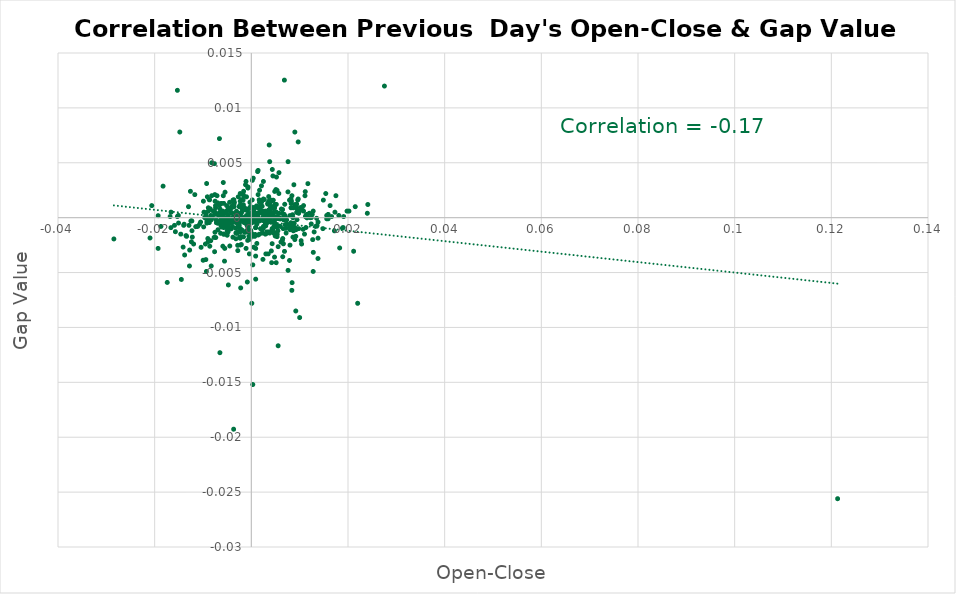
| Category | Series 0 |
|---|---|
| 0.00495000000000001 | -0.001 |
| 0.006469999999999976 | 0.001 |
| 0.0007399999999999629 | 0 |
| -0.0021799999999998487 | 0 |
| -0.005789999999999962 | 0 |
| 0.0011399999999999189 | -0.001 |
| -0.006360000000000143 | -0.001 |
| 0.005319999999999991 | 0 |
| 0.005269999999999886 | -0.001 |
| -4.999999999988347e-05 | 0.001 |
| 0.006209999999999827 | 0.001 |
| -0.012280000000000069 | -0.001 |
| -0.00723000000000007 | 0 |
| 0.0033999999999998476 | 0.001 |
| 0.011379999999999946 | 0 |
| 0.004929999999999879 | -0.001 |
| -0.005859999999999976 | 0 |
| 0.0014400000000001079 | 0 |
| 0.0040800000000000836 | 0 |
| -0.004890000000000061 | 0.001 |
| -0.009909999999999863 | 0.002 |
| 0.012419999999999876 | 0 |
| -0.0046999999999999265 | -0.001 |
| -0.006139999999999812 | -0.001 |
| 0.00270999999999999 | 0 |
| 4.0000000000040004e-05 | 0 |
| -0.005409999999999915 | 0 |
| 0.006639999999999979 | -0.002 |
| 0.006750000000000034 | 0 |
| 0.006129999999999969 | -0.002 |
| 0.008960000000000079 | 0.001 |
| -0.0035999999999998256 | 0.001 |
| -0.0042400000000000215 | 0 |
| -0.007359999999999811 | -0.002 |
| 0.0022400000000000198 | 0.001 |
| 0.005009999999999959 | 0 |
| 0.010199999999999987 | 0.001 |
| 0.00046999999999997044 | 0.001 |
| -0.004170000000000007 | -0.001 |
| -0.005929999999999991 | 0 |
| 0.005549999999999944 | -0.012 |
| 0.006839999999999957 | 0.013 |
| 0.0011399999999999189 | -0.002 |
| 0.005090000000000039 | 0.003 |
| -0.002529999999999921 | 0 |
| -0.008920000000000039 | -0.002 |
| -0.00017000000000000348 | 0.001 |
| -0.0022400000000000198 | -0.002 |
| 0.0034199999999999786 | 0 |
| -0.0001100000000000545 | -0.001 |
| -0.012210000000000054 | -0.002 |
| -0.0046399999999999775 | 0 |
| 0.000180000000000069 | 0.002 |
| 0.005169999999999897 | 0.001 |
| 9.000000000014552e-05 | -0.001 |
| -0.0007599999999998719 | -0.002 |
| -0.015060000000000073 | 0 |
| 0.012400000000000189 | -0.001 |
| -0.0021700000000000053 | 0 |
| 0.00934999999999997 | 0.001 |
| 0.0008900000000000574 | -0.001 |
| -0.006119999999999903 | 0 |
| -0.0013900000000000023 | -0.001 |
| -0.0016399999999998638 | 0.001 |
| -0.0018499999999999073 | -0.001 |
| 0.008529999999999927 | 0 |
| 0.006960000000000077 | 0 |
| 0.005549999999999944 | -0.003 |
| -0.006909999999999972 | 0.001 |
| -0.0028199999999998226 | -0.003 |
| 0.005109999999999948 | 0.001 |
| 0.012190000000000145 | 0 |
| -0.0049000000000001265 | 0 |
| 0.009379999999999944 | -0.001 |
| -0.0015499999999999403 | 0 |
| -0.004110000000000058 | 0 |
| 0.0016199999999999548 | 0.002 |
| 0.013789999999999969 | -0.004 |
| -0.02844000000000002 | -0.002 |
| -0.018260000000000165 | 0.003 |
| 0.02754000000000012 | 0.012 |
| -0.00924999999999998 | 0.003 |
| 0.007009999999999961 | -0.001 |
| -0.007520000000000193 | -0.001 |
| -0.0009400000000001629 | -0.001 |
| 0.00399000000000016 | 0 |
| -0.01193999999999984 | -0.002 |
| 0.00391000000000008 | 0 |
| 0.007160000000000055 | -0.001 |
| 0.0005100000000000104 | -0.003 |
| 0.005349999999999966 | 0 |
| -0.008829999999999893 | 0.001 |
| 0.0005599999999998939 | 0 |
| 0.010599999999999943 | 0.001 |
| 0.0025199999999998557 | 0 |
| -0.0020999999999999908 | -0.002 |
| 0.00757999999999992 | 0.002 |
| -0.0020699999999997942 | 0.002 |
| 0.0042400000000000215 | 0.002 |
| -0.0005900000000000905 | -0.001 |
| 0.002909999999999968 | -0.001 |
| -0.009409999999999918 | -0.004 |
| -0.02096000000000009 | -0.002 |
| -0.000320000000000098 | -0.002 |
| 0.0034799999999999276 | 0 |
| 0.005610000000000115 | -0.001 |
| -0.015710000000000113 | -0.001 |
| 0.0049399999999999444 | -0.002 |
| 0.0014099999999999113 | -0.002 |
| -0.003810000000000091 | -0.002 |
| -0.006569999999999965 | 0.001 |
| 0.011160000000000059 | 0.002 |
| -0.0024199999999998667 | -0.002 |
| 0.007400000000000073 | -0.001 |
| 0.004850000000000021 | -0.001 |
| -0.004730000000000123 | 0 |
| 0.005220000000000002 | 0 |
| -0.002689999999999859 | 0 |
| -0.00478999999999985 | -0.001 |
| 0.008180000000000076 | 0 |
| -0.004850000000000021 | 0 |
| -0.00254999999999983 | 0 |
| -0.005710000000000104 | 0.001 |
| 0.008240000000000025 | 0.001 |
| 0.00032999999999994145 | 0 |
| -0.014109999999999845 | -0.003 |
| -0.0014800000000001479 | 0 |
| 0.00048000000000003595 | 0.001 |
| -0.0015600000000000058 | 0 |
| 0.003940000000000055 | 0 |
| 0.0015600000000000058 | 0.001 |
| -0.009299999999999864 | 0 |
| -0.003069999999999906 | 0.001 |
| 0.006860000000000088 | -0.003 |
| 0.005719999999999947 | 0.004 |
| -0.0015399999999998748 | 0.002 |
| -0.008720000000000061 | 0.002 |
| 0.0012199999999999989 | 0 |
| 0.0029799999999999827 | -0.001 |
| -0.013510000000000133 | -0.002 |
| 0.01150999999999991 | 0 |
| -0.008650000000000047 | 0.002 |
| -0.009649999999999936 | 0 |
| -0.005420000000000202 | 0 |
| 0.0026800000000000157 | 0.002 |
| 0.0045399999999999885 | 0.002 |
| 0.0041400000000000325 | -0.003 |
| 0.003589999999999982 | 0.002 |
| 0.006909999999999972 | 0.001 |
| -0.005440000000000111 | 0.002 |
| 0.008429999999999938 | -0.006 |
| 0.0037000000000000366 | 0.007 |
| -0.0007699999999999374 | 0 |
| -0.0048200000000000465 | 0 |
| 0.008379999999999832 | -0.007 |
| -0.00939000000000001 | 0 |
| 0.0046800000000000175 | 0.001 |
| 0.018850000000000033 | -0.001 |
| 0.003530000000000033 | 0 |
| 0.0010700000000001264 | 0 |
| 0.005139999999999922 | -0.004 |
| -0.003190000000000026 | 0 |
| -0.0036399999999998656 | 0 |
| 0.005330000000000057 | -0.002 |
| 0.0011300000000000754 | 0 |
| 0.0010900000000000354 | 0.001 |
| -0.011499999999999844 | -0.001 |
| -0.003249999999999975 | -0.001 |
| -0.007540000000000102 | 0.002 |
| -0.012759999999999883 | -0.003 |
| -0.0019899999999999363 | -0.001 |
| -0.0016200000000001769 | -0.002 |
| 0.0015400000000000968 | 0 |
| -0.005250000000000199 | -0.001 |
| 0.008399999999999963 | 0.002 |
| 0.004690000000000083 | -0.001 |
| -0.0021799999999998487 | 0 |
| 0.004809999999999981 | 0.001 |
| 0.013600000000000056 | -0.001 |
| 0.007919999999999927 | -0.001 |
| -0.0010300000000000864 | 0 |
| -0.008690000000000087 | 0 |
| 3.0000000000196536e-05 | 0 |
| -0.0029999999999998916 | 0 |
| -0.0005300000000001415 | 0 |
| -0.004029999999999978 | 0 |
| -0.0026600000000001067 | -0.001 |
| -0.0017100000000001003 | 0.002 |
| 0.006429999999999936 | -0.002 |
| 0.008610000000000007 | -0.002 |
| 0.013800000000000034 | -0.002 |
| -0.0023200000000000998 | -0.002 |
| 0.0043400000000000105 | 0.004 |
| -0.019279999999999964 | 0 |
| -0.0014399999999998858 | 0 |
| 0.010709999999999997 | -0.001 |
| 0.009449999999999958 | 0 |
| 0.0047999999999999154 | -0.004 |
| -0.003190000000000026 | -0.002 |
| -0.0022800000000000598 | 0 |
| -0.0044600000000001305 | -0.003 |
| -0.0016800000000001258 | 0 |
| 0.003940000000000055 | 0.001 |
| -0.0029200000000000337 | 0 |
| -0.0023400000000000087 | 0.001 |
| 0.005319999999999991 | 0.002 |
| 0.004310000000000036 | -0.002 |
| 0.008190000000000142 | -0.001 |
| -0.01929000000000003 | -0.003 |
| -0.009190000000000031 | 0 |
| -0.0022800000000000598 | 0.001 |
| -0.007640000000000091 | 0.005 |
| -0.0006999999999999229 | -0.001 |
| -0.0031999999999998696 | 0 |
| 0.01028999999999991 | 0.001 |
| -0.006680000000000019 | 0 |
| -0.0025100000000000122 | -0.001 |
| -0.016639999999999988 | -0.001 |
| 0.008879999999999999 | -0.001 |
| -0.0020599999999999508 | -0.002 |
| -0.003610000000000113 | 0.002 |
| -0.0022500000000000853 | -0.001 |
| 0.021160000000000068 | -0.003 |
| -0.0010900000000000354 | -0.003 |
| 0.013509999999999911 | 0 |
| -0.009970000000000034 | -0.004 |
| -0.0004799999999998139 | 0 |
| -0.006139999999999812 | 0 |
| -0.0041400000000000325 | -0.001 |
| 0.00021000000000004349 | 0.003 |
| -0.0022900000000001253 | 0.001 |
| 0.009460000000000024 | 0 |
| -0.008110000000000062 | 0 |
| 0.0048400000000001775 | 0.002 |
| -0.0033400000000001207 | 0 |
| 0.00010000000000021103 | 0 |
| -0.0026600000000001067 | -0.001 |
| 0.009380000000000166 | 0.001 |
| 0.007980000000000098 | 0 |
| 0.0007999999999999119 | -0.002 |
| 0.00399000000000016 | 0 |
| 0.004469999999999974 | 0.004 |
| -0.0037199999999999456 | 0 |
| -0.0036599999999999966 | -0.019 |
| 0.012820000000000054 | -0.003 |
| -0.00985999999999998 | -0.001 |
| -0.0008300000000001084 | -0.006 |
| -0.006909999999999972 | -0.001 |
| 0.0006299999999999084 | 0 |
| -0.014480000000000048 | -0.006 |
| -0.0030200000000000227 | -0.001 |
| 0.005360000000000031 | -0.002 |
| -0.005549999999999944 | -0.004 |
| -0.004750000000000032 | -0.006 |
| -0.00279000000000007 | 0 |
| 0.0024800000000000377 | -0.001 |
| 0.00649999999999995 | -0.004 |
| 0.018280000000000074 | -0.003 |
| -0.001000000000000112 | 0 |
| 0.011500000000000066 | 0 |
| 0.02400000000000002 | 0 |
| 0.0025999999999999357 | 0 |
| -0.0020000000000000018 | 0 |
| 0.006000000000000005 | 0 |
| 0.009199999999999875 | -0.002 |
| 0.0037000000000000366 | 0.001 |
| 0.0038000000000000256 | 0.001 |
| -0.006199999999999983 | 0.001 |
| 0.011700000000000044 | 0.003 |
| 0.01629999999999998 | 0.001 |
| -0.0049000000000001265 | -0.001 |
| 0.0032999999999998586 | -0.001 |
| 0.12129999999999996 | -0.026 |
| -0.015300000000000091 | 0.012 |
| 0.01980000000000004 | 0.001 |
| -0.009300000000000086 | -0.005 |
| 0.0052000000000000934 | -0.001 |
| 0.010800000000000143 | 0.001 |
| 0.009000000000000119 | -0.001 |
| 0.005499999999999838 | -0.001 |
| -0.001000000000000112 | -0.001 |
| -0.008199999999999985 | 0.005 |
| -0.0047999999999999154 | -0.001 |
| -0.006900000000000128 | -0.001 |
| 0.013299999999999867 | -0.001 |
| 0.0019000000000000128 | -0.001 |
| 0.00019999999999997797 | -0.002 |
| -0.010699999999999932 | -0.001 |
| -0.005700000000000038 | -0.002 |
| 0.009200000000000097 | -0.001 |
| -0.00649999999999995 | -0.012 |
| -0.0027999999999999137 | -0.001 |
| 0.008700000000000152 | 0 |
| 0.011399999999999855 | 0 |
| -0.0048000000000001375 | 0 |
| 0.015600000000000058 | 0 |
| 0.009400000000000075 | 0 |
| 9.999999999998899e-05 | -0.008 |
| -0.007600000000000051 | -0.003 |
| 0.0004999999999999449 | 0 |
| -0.006699999999999928 | 0 |
| 0.0037000000000000366 | 0 |
| 0.006799999999999917 | 0 |
| 0.009799999999999809 | -0.001 |
| 0.00010000000000021103 | 0 |
| 0.015900000000000025 | 0 |
| -0.011700000000000044 | 0.002 |
| 0.008099999999999996 | -0.001 |
| 0.0022999999999999687 | 0.001 |
| 0.0028999999999999027 | 0 |
| -0.0051000000000001044 | 0.001 |
| 0.004899999999999904 | 0.001 |
| 0.006000000000000005 | -0.001 |
| 0.0013000000000000789 | 0 |
| 0.008700000000000152 | 0.001 |
| 0.0014000000000000679 | 0.002 |
| -0.00019999999999997797 | -0.001 |
| -0.0036000000000000476 | 0.001 |
| 0.0017000000000000348 | 0 |
| -0.0017000000000000348 | 0.002 |
| 0.00019999999999997797 | 0 |
| 0.00029999999999996696 | 0.001 |
| -0.013399999999999856 | -0.002 |
| 0.0034999999999998366 | -0.003 |
| 0.00029999999999996696 | -0.004 |
| 9.999999999998899e-05 | 0 |
| -0.0044999999999999485 | -0.001 |
| 0.009700000000000042 | 0.001 |
| 0.0026000000000001577 | 0 |
| 0.017200000000000104 | -0.001 |
| 0.004899999999999904 | 0.001 |
| -0.0040999999999999925 | 0.001 |
| 0.021499999999999853 | 0.001 |
| -0.012899999999999912 | -0.001 |
| -0.0030999999999998806 | 0 |
| 0.008000000000000007 | -0.001 |
| -0.009200000000000097 | 0 |
| -0.0022999999999999687 | 0.002 |
| -0.02059999999999995 | 0.001 |
| 0.013800000000000034 | 0 |
| 0.020199999999999996 | 0.001 |
| -0.0030000000000001137 | -0.001 |
| 0.0010999999999998789 | -0.001 |
| -0.0012000000000000899 | 0.003 |
| 0.008000000000000007 | -0.002 |
| 0.0012999999999998568 | 0.004 |
| 0.0016999999999998128 | 0.001 |
| 0.0032000000000000917 | -0.001 |
| -0.007100000000000106 | 0.002 |
| 0.02200000000000002 | -0.008 |
| -0.000700000000000145 | 0.001 |
| 0.0044999999999999485 | 0 |
| 0.0009999999999998899 | 0 |
| 0.00869999999999993 | -0.001 |
| 0.008200000000000207 | -0.001 |
| 0.0038000000000000256 | -0.001 |
| 0.0040999999999999925 | 0.002 |
| -0.0044999999999999485 | 0.001 |
| 0.0009000000000001229 | -0.003 |
| -0.005900000000000016 | 0 |
| -0.00029999999999996696 | 0.001 |
| 0.0045000000000001705 | 0 |
| 0.018100000000000005 | 0 |
| 0.007199999999999873 | -0.001 |
| 0.011099999999999888 | 0.002 |
| -0.0014000000000000679 | 0.001 |
| 0.00029999999999996696 | -0.015 |
| -0.0009999999999998899 | 0 |
| 0.0006999999999999229 | -0.002 |
| -0.0006999999999999229 | 0.003 |
| 0.005700000000000038 | 0 |
| 0.005799999999999805 | 0 |
| 0.0009999999999998899 | 0 |
| 0.0016000000000000458 | 0 |
| 0.001100000000000101 | 0 |
| -0.0005999999999999339 | 0 |
| -0.001100000000000101 | 0 |
| 0.0025999999999999357 | 0 |
| -0.0035999999999998256 | 0.001 |
| 0.0018000000000000238 | 0.001 |
| -0.0039000000000000146 | 0.001 |
| 0.0036000000000000476 | 0 |
| -0.0027999999999999137 | 0 |
| 0.008199999999999985 | 0 |
| 0.0019000000000000128 | 0.001 |
| -0.00019999999999997797 | 0 |
| 0.00029999999999996696 | 0 |
| 0.0047999999999999154 | 0 |
| 0.0020999999999999908 | 0 |
| -0.0034999999999998366 | 0.001 |
| 0.0021999999999999797 | -0.001 |
| -0.0026000000000001577 | -0.001 |
| 0.0021999999999999797 | 0 |
| -0.005499999999999838 | -0.003 |
| 0.0034000000000000696 | 0.001 |
| -0.009100000000000108 | 0.002 |
| -0.008299999999999974 | 0 |
| 0.0050000000000001155 | -0.001 |
| 0.015399999999999858 | 0.002 |
| -0.007000000000000117 | 0 |
| -0.00020000000000020002 | 0 |
| 0.0029000000000001247 | -0.002 |
| -0.006799999999999917 | 0 |
| 0.0036000000000000476 | 0.001 |
| 0.0049000000000001265 | 0 |
| -0.0014000000000000679 | 0 |
| -0.0025999999999999357 | 0 |
| -0.0025000000000001688 | 0 |
| -0.005099999999999882 | 0.001 |
| 0.00869999999999993 | -0.001 |
| 0.01200000000000001 | 0 |
| 0.0040000000000000036 | 0.001 |
| -0.00039999999999995595 | 0 |
| 0.0020999999999999908 | 0.003 |
| 0.014899999999999913 | 0.002 |
| -0.009799999999999809 | 0 |
| 0.0027999999999999137 | 0 |
| -0.006599999999999939 | 0.007 |
| -0.0039000000000000146 | -0.001 |
| 0.0014000000000000679 | 0.004 |
| 0.0020000000000000018 | 0 |
| 0.0009000000000001229 | -0.001 |
| 0.0039000000000000146 | 0 |
| -0.016599999999999948 | 0 |
| 0.0011999999999998678 | 0 |
| -0.0026999999999999247 | 0.002 |
| 0.008199999999999985 | 0.002 |
| 0.019000000000000128 | -0.001 |
| 0.0043000000000001926 | -0.001 |
| 0.010399999999999965 | -0.002 |
| 0.0024999999999999467 | 0.002 |
| 0.004200000000000204 | -0.004 |
| 0.0035999999999998256 | 0.002 |
| -0.001000000000000112 | 0.002 |
| 0.009700000000000042 | 0.002 |
| 0.01079999999999992 | 0.001 |
| -0.0040000000000000036 | 0 |
| -0.0038000000000000256 | 0.002 |
| 0.0047000000000001485 | 0 |
| 0.0040000000000000036 | 0 |
| -0.010400000000000187 | -0.003 |
| 0.00039999999999995595 | 0 |
| -0.005800000000000027 | 0 |
| -0.0024999999999999467 | 0.001 |
| 0.009800000000000031 | 0 |
| 0.012799999999999923 | 0.001 |
| 0.009200000000000097 | -0.008 |
| -0.0023000000000001908 | -0.001 |
| -0.007600000000000051 | 0 |
| 0.016599999999999948 | 0 |
| -0.00039999999999995595 | -0.003 |
| 0.0129999999999999 | -0.001 |
| 0.0038000000000000256 | 0 |
| 0.0039000000000000146 | 0.001 |
| -0.005800000000000027 | 0.002 |
| 0.010999999999999899 | -0.002 |
| -0.006099999999999994 | 0 |
| 0.001000000000000112 | 0 |
| 0.0029000000000001247 | 0.001 |
| -0.00890000000000013 | 0.001 |
| -0.0012000000000000899 | 0.001 |
| 0.008199999999999985 | 0.001 |
| 0.011299999999999866 | -0.001 |
| 0.0012999999999998568 | 0 |
| 0.005499999999999838 | 0 |
| -0.0019000000000000128 | 0.001 |
| 0.0050000000000001155 | 0 |
| 0.00649999999999995 | -0.002 |
| -0.0007999999999999119 | 0.001 |
| -0.006399999999999961 | 0 |
| -0.007900000000000018 | 0.001 |
| -0.007500000000000062 | 0.001 |
| 0.0047999999999999154 | 0.001 |
| 0.0040000000000000036 | 0.001 |
| -0.005700000000000038 | -0.002 |
| -0.012400000000000189 | -0.002 |
| -0.006000000000000005 | -0.001 |
| 0.00969999999999982 | 0.001 |
| -0.015099999999999891 | 0 |
| 0.0042999999999999705 | -0.001 |
| -0.01869999999999994 | -0.001 |
| 0.0017000000000000348 | -0.002 |
| -0.015900000000000025 | -0.001 |
| 0.0052000000000000934 | 0.004 |
| 0.0036000000000000476 | 0 |
| -0.0006999999999999229 | 0.003 |
| -0.0024999999999999467 | -0.001 |
| 0.006699999999999928 | 0 |
| 0.0043999999999999595 | -0.001 |
| -0.008500000000000174 | 0.001 |
| -0.006000000000000005 | 0 |
| 0.011299999999999866 | 0 |
| -0.0044999999999999485 | 0.001 |
| -0.006000000000000005 | 0.001 |
| -0.0043999999999999595 | 0.001 |
| -0.013900000000000023 | -0.001 |
| 0.014800000000000146 | -0.001 |
| 0.012600000000000167 | 0 |
| -0.0129999999999999 | 0.001 |
| -0.0016000000000000458 | 0.002 |
| 0.005700000000000038 | 0.002 |
| -0.0008999999999999009 | -0.001 |
| -0.0052000000000000934 | 0 |
| -0.008999999999999897 | -0.002 |
| 0.0023999999999999577 | -0.004 |
| 0.007300000000000084 | 0 |
| -0.012800000000000145 | -0.004 |
| 0.009300000000000086 | 0.001 |
| -0.0020000000000000018 | 0 |
| -0.0032000000000000917 | -0.001 |
| 0.008799999999999919 | 0.003 |
| 0.0038000000000000256 | 0.005 |
| -0.005700000000000038 | -0.001 |
| -0.012600000000000167 | 0.002 |
| 0.00039999999999995595 | 0.004 |
| -0.0027000000000001467 | 0 |
| -0.014599999999999946 | -0.002 |
| -0.007400000000000073 | 0.001 |
| -0.012299999999999978 | 0 |
| 0.0029999999999998916 | -0.003 |
| -0.005800000000000027 | 0.003 |
| 0.0008999999999999009 | -0.006 |
| 0.007599999999999829 | -0.005 |
| -0.0021999999999999797 | -0.006 |
| -0.00770000000000004 | -0.002 |
| 0.0012999999999998568 | 0 |
| -0.005099999999999882 | 0 |
| -0.014799999999999924 | 0.008 |
| -0.006299999999999972 | 0 |
| 0.0025000000000001688 | 0.003 |
| 0.0008999999999999009 | -0.004 |
| -0.008299999999999974 | -0.004 |
| -0.004999999999999893 | -0.001 |
| 0.006400000000000183 | 0 |
| -0.0027999999999999137 | -0.003 |
| 0.015600000000000058 | 0 |
| -0.0050000000000001155 | -0.002 |
| -0.01110000000000011 | -0.001 |
| 0.00029999999999996696 | 0 |
| 0.007900000000000018 | 0.002 |
| 0.0035999999999998256 | -0.001 |
| -0.005900000000000016 | 0.001 |
| 0.0017000000000000348 | 0.002 |
| 0.0045999999999999375 | -0.001 |
| -0.006299999999999972 | -0.001 |
| -0.008799999999999919 | 0 |
| 0.007899999999999796 | -0.004 |
| -0.008399999999999963 | 0 |
| -0.0016000000000000458 | 0.001 |
| 0.0007999999999999119 | 0.001 |
| 0.0025000000000001688 | -0.001 |
| -0.007500000000000062 | 0 |
| 0.008999999999999897 | -0.002 |
| 0.0022999999999999687 | -0.001 |
| 0.006599999999999939 | -0.001 |
| -0.008999999999999897 | 0 |
| -0.0023999999999999577 | 0 |
| -0.009500000000000064 | -0.002 |
| -0.01739999999999986 | -0.006 |
| 0.0020999999999999908 | 0.001 |
| 0.010299999999999976 | -0.002 |
| -0.0028000000000001357 | -0.001 |
| -0.016799999999999926 | 0 |
| 0.017300000000000093 | 0 |
| 0.007300000000000084 | -0.001 |
| -0.0010999999999998789 | 0.003 |
| 0.009600000000000053 | 0.002 |
| -0.007399999999999851 | 0.001 |
| 0.0032000000000000917 | -0.001 |
| -0.0004999999999999449 | -0.002 |
| -0.008399999999999963 | -0.002 |
| -0.008600000000000163 | -0.003 |
| -0.01529999999999987 | 0 |
| -0.0022999999999999687 | 0.002 |
| 0.005800000000000027 | 0 |
| -0.005900000000000016 | -0.003 |
| -0.0005999999999999339 | -0.001 |
| 0.004100000000000215 | 0 |
| 9.999999999998899e-05 | 0 |
| -0.006500000000000172 | 0.001 |
| -0.008199999999999985 | 0.002 |
| -0.014000000000000012 | -0.001 |
| 0.012699999999999934 | -0.002 |
| 0.008299999999999974 | 0.002 |
| -0.0030000000000001137 | 0 |
| -0.012499999999999956 | 0 |
| -0.0009999999999998899 | 0 |
| 0.01749999999999985 | 0.002 |
| 0.019099999999999895 | 0 |
| 0.011199999999999877 | 0 |
| -0.006199999999999983 | 0 |
| 0.006000000000000005 | 0 |
| 0.009700000000000042 | 0.007 |
| 0.007600000000000051 | 0.005 |
| -0.0032000000000000917 | 0 |
| 0.010000000000000009 | -0.009 |
| -0.007299999999999862 | 0 |
| 0.009000000000000119 | 0.008 |
| -0.0048000000000001375 | 0 |
| 0.024099999999999788 | 0.001 |
| -0.013800000000000034 | -0.003 |
| -0.010500000000000176 | 0 |
| 0.0012000000000000899 | 0 |
| -0.0040999999999999925 | 0 |
| 9.999999999998899e-05 | 0 |
| 0.012799999999999923 | -0.005 |
| 0.015900000000000025 | 0 |
| 0.008599999999999941 | 0 |
| 0.007099999999999884 | 0 |
| -0.009000000000000119 | 0 |